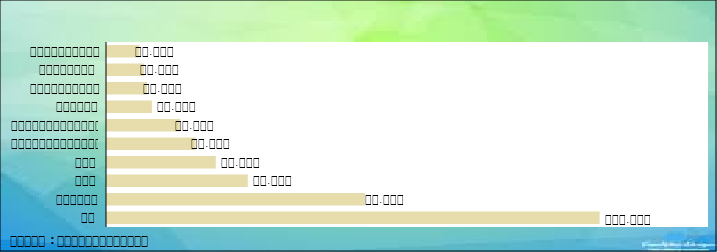
| Category | Series 0 |
|---|---|
| ថៃ | 163661 |
| វៀតណាម | 85700 |
| ចិន | 46781 |
| ឡាវ | 36153 |
| កូរ៉េខាងត្បូង | 29429 |
| សហរដ្ឋអាមេរិក | 24372 |
| បារាំង | 14907 |
| ឥណ្ឌូនេស៊ី | 13273 |
| អង់គ្លេស  | 12281 |
| អូស្រ្តាលី | 10707 |